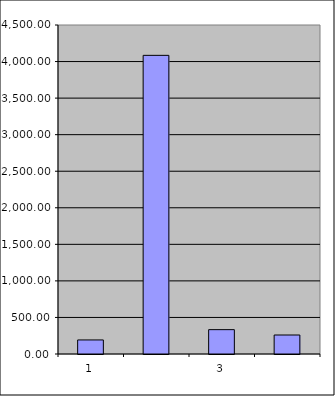
| Category | Series 0 |
|---|---|
| 0 | 192.25 |
| 1 | 4084.815 |
| 2 | 333.086 |
| 3 | 259.685 |